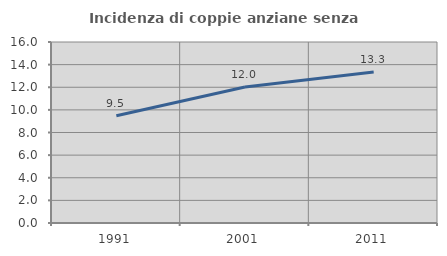
| Category | Incidenza di coppie anziane senza figli  |
|---|---|
| 1991.0 | 9.475 |
| 2001.0 | 12.021 |
| 2011.0 | 13.347 |